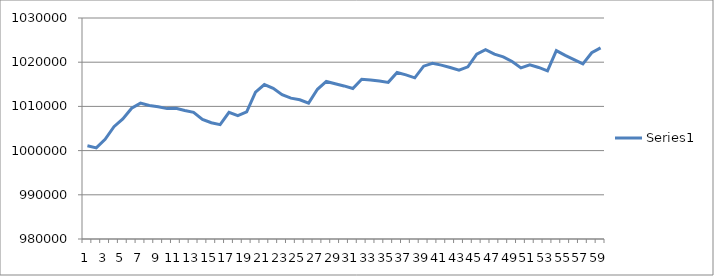
| Category | Series 0 |
|---|---|
| 0 | 1001080.991 |
| 1 | 1000604.2 |
| 2 | 1002542.703 |
| 3 | 1005418.201 |
| 4 | 1007152.073 |
| 5 | 1009596.769 |
| 6 | 1010749.058 |
| 7 | 1010222.94 |
| 8 | 1009916.747 |
| 9 | 1009502.746 |
| 10 | 1009578.029 |
| 11 | 1009063.005 |
| 12 | 1008643.403 |
| 13 | 1007066.02 |
| 14 | 1006302.746 |
| 15 | 1005877.975 |
| 16 | 1008667.313 |
| 17 | 1007908.885 |
| 18 | 1008748.842 |
| 19 | 1013207.539 |
| 20 | 1014941.411 |
| 21 | 1014097.792 |
| 22 | 1012667.959 |
| 23 | 1011877.329 |
| 24 | 1011501.346 |
| 25 | 1010740.442 |
| 26 | 1013874.421 |
| 27 | 1015640.603 |
| 28 | 1015128.056 |
| 29 | 1014632.741 |
| 30 | 1014037.695 |
| 31 | 1016137.749 |
| 32 | 1015997.631 |
| 33 | 1015749.058 |
| 34 | 1015436.403 |
| 35 | 1017665.697 |
| 36 | 1017122.994 |
| 37 | 1016464.728 |
| 38 | 1019103.285 |
| 39 | 1019757.781 |
| 40 | 1019330.856 |
| 41 | 1018786.861 |
| 42 | 1018183.63 |
| 43 | 1018948.196 |
| 44 | 1021802.154 |
| 45 | 1022857.512 |
| 46 | 1021820.14 |
| 47 | 1021208.401 |
| 48 | 1020164.136 |
| 49 | 1018709.208 |
| 50 | 1019387.614 |
| 51 | 1018810.878 |
| 52 | 1018050.404 |
| 53 | 1022627.571 |
| 54 | 1021553.473 |
| 55 | 1020585.46 |
| 56 | 1019625.417 |
| 57 | 1022134.733 |
| 58 | 1023243.942 |